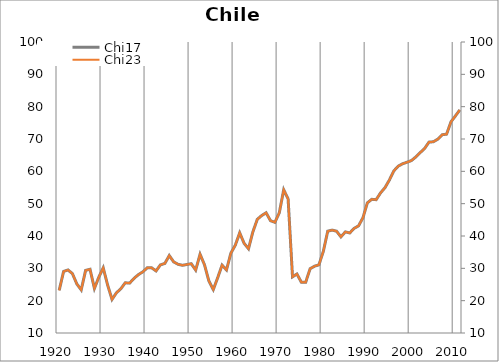
| Category | Chi17 |
|---|---|
| 1920.0 | 23.195 |
| 1921.0 | 29.031 |
| 1922.0 | 29.495 |
| 1923.0 | 28.378 |
| 1924.0 | 25.182 |
| 1925.0 | 23.337 |
| 1926.0 | 29.363 |
| 1927.0 | 29.709 |
| 1928.0 | 23.791 |
| 1929.0 | 27.28 |
| 1930.0 | 30.143 |
| 1931.0 | 24.835 |
| 1932.0 | 20.386 |
| 1933.0 | 22.426 |
| 1934.0 | 23.685 |
| 1935.0 | 25.53 |
| 1936.0 | 25.429 |
| 1937.0 | 26.906 |
| 1938.0 | 28.055 |
| 1939.0 | 28.922 |
| 1940.0 | 30.16 |
| 1941.0 | 30.157 |
| 1942.0 | 29.201 |
| 1943.0 | 31.078 |
| 1944.0 | 31.515 |
| 1945.0 | 33.952 |
| 1946.0 | 32.001 |
| 1947.0 | 31.246 |
| 1948.0 | 30.941 |
| 1949.0 | 31.184 |
| 1950.0 | 31.426 |
| 1951.0 | 29.461 |
| 1952.0 | 34.357 |
| 1953.0 | 31.114 |
| 1954.0 | 26.097 |
| 1955.0 | 23.43 |
| 1956.0 | 27.087 |
| 1957.0 | 30.989 |
| 1958.0 | 29.506 |
| 1959.0 | 34.703 |
| 1960.0 | 37.148 |
| 1961.0 | 40.983 |
| 1962.0 | 37.744 |
| 1963.0 | 36.065 |
| 1964.0 | 41.303 |
| 1965.0 | 45.152 |
| 1966.0 | 46.331 |
| 1967.0 | 47.178 |
| 1968.0 | 44.731 |
| 1969.0 | 44.229 |
| 1970.0 | 47.185 |
| 1971.0 | 54.301 |
| 1972.0 | 51.455 |
| 1973.0 | 27.369 |
| 1974.0 | 28.245 |
| 1975.0 | 25.727 |
| 1976.0 | 25.727 |
| 1977.0 | 29.887 |
| 1978.0 | 30.654 |
| 1979.0 | 31.092 |
| 1980.0 | 35.252 |
| 1981.0 | 41.492 |
| 1982.0 | 41.821 |
| 1983.0 | 41.492 |
| 1984.0 | 39.741 |
| 1985.0 | 41.273 |
| 1986.0 | 40.945 |
| 1987.0 | 42.368 |
| 1988.0 | 43.134 |
| 1989.0 | 45.652 |
| 1990.0 | 50.25 |
| 1991.0 | 51.345 |
| 1992.0 | 51.236 |
| 1993.0 | 53.34 |
| 1994.0 | 54.938 |
| 1995.0 | 57.299 |
| 1996.0 | 60.111 |
| 1997.0 | 61.589 |
| 1998.0 | 62.34 |
| 1999.0 | 62.811 |
| 2000.0 | 63.32 |
| 2001.0 | 64.429 |
| 2002.0 | 65.781 |
| 2003.0 | 67.056 |
| 2004.0 | 69.038 |
| 2005.0 | 69.146 |
| 2006.0 | 69.947 |
| 2007.0 | 71.323 |
| 2008.0 | 71.5 |
| 2009.0 | 75.318 |
| 2010.0 | 77.13 |
| 2011.0 | 78.986 |